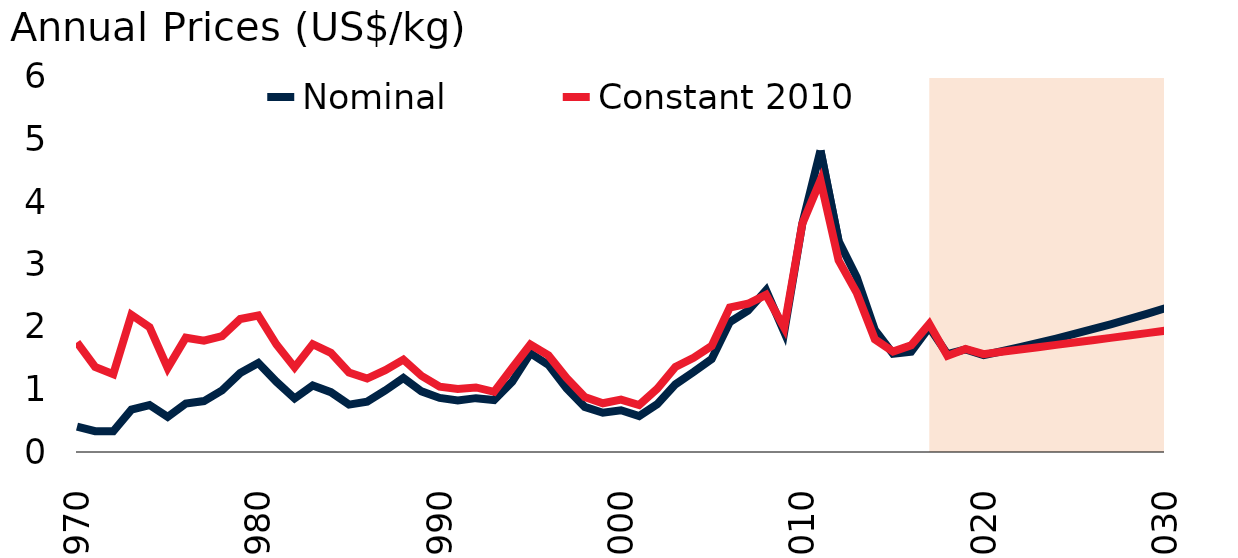
| Category | Nominal | Constant 2010 |
|---|---|---|
| 1970.0 | 0.407 | 1.754 |
| 1971.0 | 0.333 | 1.362 |
| 1972.0 | 0.332 | 1.246 |
| 1973.0 | 0.678 | 2.195 |
| 1974.0 | 0.752 | 1.997 |
| 1975.0 | 0.561 | 1.342 |
| 1976.0 | 0.774 | 1.828 |
| 1977.0 | 0.815 | 1.781 |
| 1978.0 | 0.986 | 1.854 |
| 1979.0 | 1.262 | 2.128 |
| 1980.0 | 1.425 | 2.184 |
| 1981.0 | 1.123 | 1.72 |
| 1982.0 | 0.858 | 1.354 |
| 1983.0 | 1.064 | 1.725 |
| 1984.0 | 0.958 | 1.588 |
| 1985.0 | 0.759 | 1.271 |
| 1986.0 | 0.807 | 1.175 |
| 1987.0 | 0.985 | 1.309 |
| 1988.0 | 1.185 | 1.479 |
| 1989.0 | 0.97 | 1.218 |
| 1990.0 | 0.865 | 1.046 |
| 1991.0 | 0.826 | 1.008 |
| 1992.0 | 0.862 | 1.033 |
| 1993.0 | 0.831 | 0.963 |
| 1994.0 | 1.126 | 1.345 |
| 1995.0 | 1.58 | 1.719 |
| 1996.0 | 1.394 | 1.546 |
| 1997.0 | 1.018 | 1.184 |
| 1998.0 | 0.722 | 0.878 |
| 1999.0 | 0.628 | 0.78 |
| 2000.0 | 0.667 | 0.839 |
| 2001.0 | 0.575 | 0.751 |
| 2002.0 | 0.765 | 1.011 |
| 2003.0 | 1.083 | 1.36 |
| 2004.0 | 1.28 | 1.506 |
| 2005.0 | 1.488 | 1.697 |
| 2006.0 | 2.079 | 2.312 |
| 2007.0 | 2.263 | 2.371 |
| 2008.0 | 2.586 | 2.515 |
| 2009.0 | 1.921 | 1.991 |
| 2010.0 | 3.654 | 3.654 |
| 2011.0 | 4.823 | 4.345 |
| 2012.0 | 3.377 | 3.065 |
| 2013.0 | 2.795 | 2.548 |
| 2014.0 | 1.951 | 1.803 |
| 2015.0 | 1.571 | 1.606 |
| 2016.0 | 1.605 | 1.707 |
| 2017.0 | 1.995 | 2.05 |
| 2018.0 | 1.565 | 1.538 |
| 2019.0 | 1.64 | 1.649 |
| 2020.0 | 1.55 | 1.566 |
| 2021.0 | 1.612 | 1.603 |
| 2022.0 | 1.677 | 1.64 |
| 2023.0 | 1.745 | 1.677 |
| 2024.0 | 1.815 | 1.714 |
| 2025.0 | 1.888 | 1.751 |
| 2026.0 | 1.964 | 1.788 |
| 2027.0 | 2.043 | 1.826 |
| 2028.0 | 2.125 | 1.864 |
| 2029.0 | 2.211 | 1.902 |
| 2030.0 | 2.3 | 1.94 |